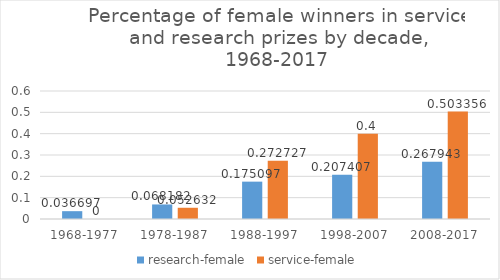
| Category | research-female | service-female |
|---|---|---|
| 1968-1977 | 0.037 | 0 |
| 1978-1987 | 0.068 | 0.053 |
| 1988-1997 | 0.175 | 0.273 |
| 1998-2007 | 0.207 | 0.4 |
| 2008-2017 | 0.268 | 0.503 |